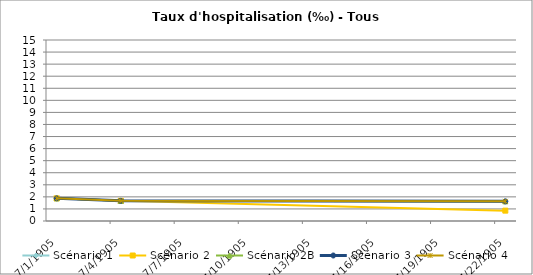
| Category | Scénario 1 | Scénario 2 | Scénario 2B | Scénario 3 | Scénario 4 |
|---|---|---|---|---|---|
| 2009.0 | 1.877 | 1.877 | 1.877 | 1.877 | 1.877 |
| 2012.0 | 1.669 | 1.669 | 1.669 | 1.669 | 1.669 |
| 2030.0 | 1.627 | 0.859 | 1.627 | 1.627 | 1.627 |